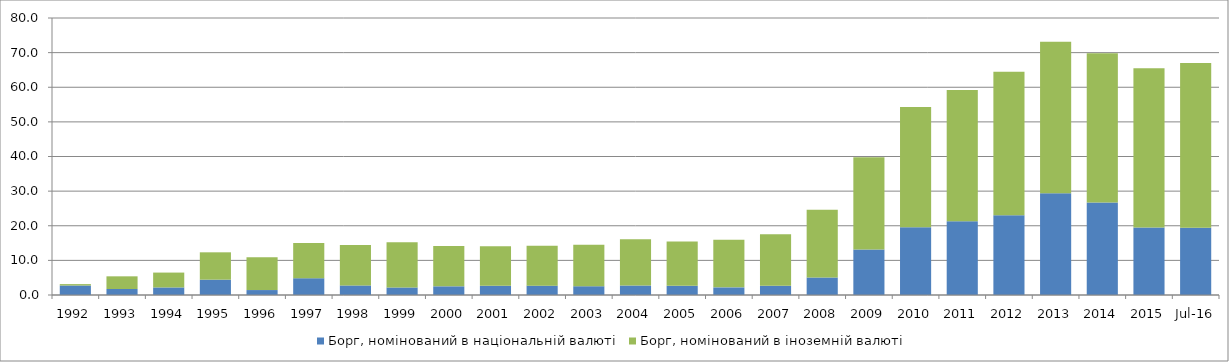
| Category | Борг, номінований в національній валюті | Борг, номінований в іноземній валюті |
|---|---|---|
| 1992.0 | 2.743 | 0.404 |
| 1993.0 | 1.732 | 3.661 |
| 1994.0 | 2.184 | 4.292 |
| 1995.0 | 4.433 | 7.895 |
| 1996.0 | 1.427 | 9.468 |
| 1997.0 | 4.845 | 10.164 |
| 1998.0 | 2.759 | 11.647 |
| 1999.0 | 2.176 | 13.072 |
| 2000.0 | 2.507 | 11.657 |
| 2001.0 | 2.65 | 11.419 |
| 2002.0 | 2.694 | 11.508 |
| 2003.0 | 2.533 | 12.01 |
| 2004.0 | 2.766 | 13.331 |
| 2005.0 | 2.666 | 12.809 |
| 2006.0 | 2.205 | 13.745 |
| 2007.0 | 2.69 | 14.883 |
| 2008.0 | 5.06 | 19.539 |
| 2009.0 | 13.143 | 26.67 |
| 2010.0 | 19.538 | 34.76 |
| 2011.0 | 21.329 | 37.894 |
| 2012.0 | 23.046 | 41.449 |
| 2013.0 | 29.397 | 43.765 |
| 2014.0 | 26.747 | 43.065 |
| 2015.0 | 19.515 | 45.99 |
| 42582.0 | 19.392 | 47.603 |